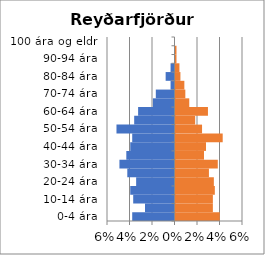
| Category | % karlar | %konur |
|---|---|---|
| 0-4 ára | -0.038 | 0.039 |
| 5-9 ára | -0.026 | 0.033 |
| 10-14 ára | -0.037 | 0.033 |
| 15-19 ára | -0.039 | 0.035 |
| 20-24 ára | -0.034 | 0.034 |
| 25-29 ára | -0.042 | 0.03 |
| 30-34 ára | -0.049 | 0.038 |
| 35-39 ára | -0.043 | 0.025 |
| 40-44 ára | -0.039 | 0.027 |
| 45-49 ára | -0.038 | 0.042 |
| 50-54 ára | -0.052 | 0.024 |
| 55-59 ára | -0.036 | 0.017 |
| 60-64 ára | -0.032 | 0.029 |
| 65-69 ára | -0.019 | 0.012 |
| 70-74 ára | -0.017 | 0.009 |
| 75-79 ára | -0.003 | 0.008 |
| 80-84 ára | -0.008 | 0.004 |
| 85-89 ára | -0.003 | 0.003 |
| 90-94 ára | 0 | 0.001 |
| 95-99 ára | 0 | 0.001 |
| 100 ára og eldri | 0 | 0 |